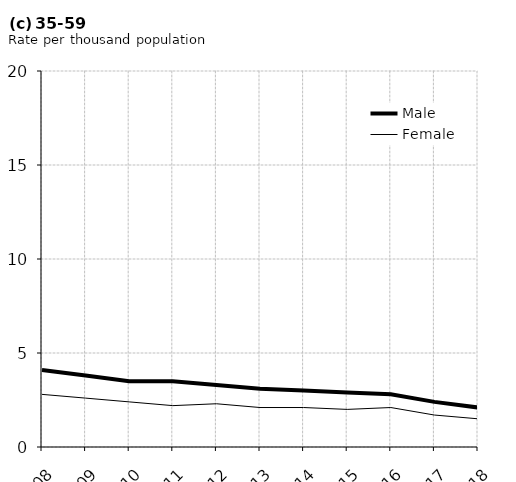
| Category | Male | Female |
|---|---|---|
| 2008.0 | 4.1 | 2.8 |
| 2009.0 | 3.8 | 2.6 |
| 2010.0 | 3.5 | 2.4 |
| 2011.0 | 3.5 | 2.2 |
| 2012.0 | 3.3 | 2.3 |
| 2013.0 | 3.1 | 2.1 |
| 2014.0 | 3 | 2.1 |
| 2015.0 | 2.9 | 2 |
| 2016.0 | 2.8 | 2.1 |
| 2017.0 | 2.4 | 1.7 |
| 2018.0 | 2.1 | 1.5 |